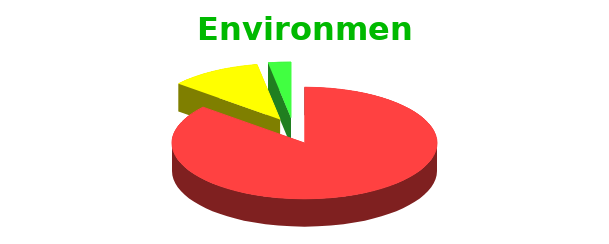
| Category | Environment |
|---|---|
| Unconsciously Incompetent | 31 |
| Consciously Incompetent | 4 |
| Consciously Competent | 1 |